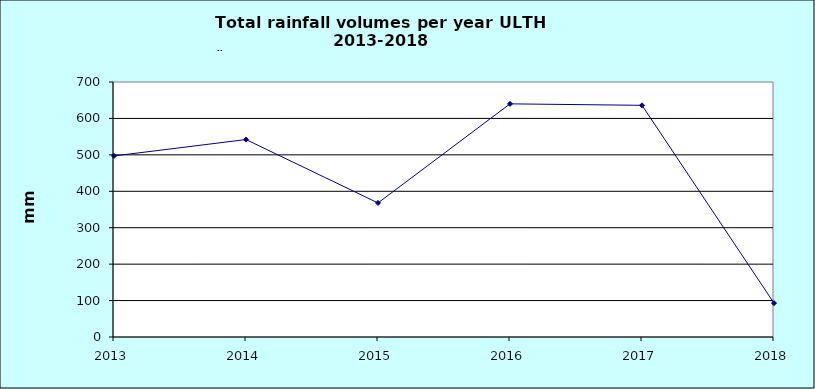
| Category | Series 0 |
|---|---|
| 2013.0 | 497 |
| 2014.0 | 542 |
| 2015.0 | 368 |
| 2016.0 | 640 |
| 2017.0 | 636 |
| 2018.0 | 93 |